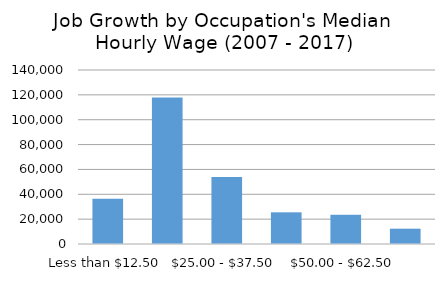
| Category | Series 0 |
|---|---|
| Less than $12.50 | 36381 |
| $12.50 - $25.00 | 117903 |
| $25.00 - $37.50 | 53891 |
| $37.50 - $50.00 | 25488 |
| $50.00 - $62.50 | 23517 |
| Over $62.50  | 12321 |